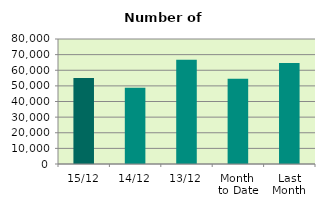
| Category | Series 0 |
|---|---|
| 15/12 | 55042 |
| 14/12 | 48780 |
| 13/12 | 66720 |
| Month 
to Date | 54593.818 |
| Last
Month | 64659.273 |